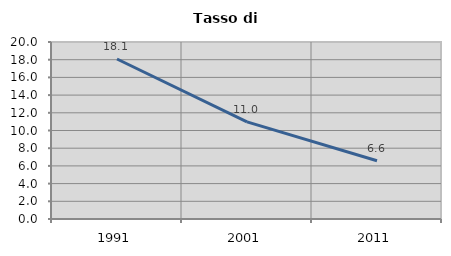
| Category | Tasso di disoccupazione   |
|---|---|
| 1991.0 | 18.077 |
| 2001.0 | 10.97 |
| 2011.0 | 6.579 |